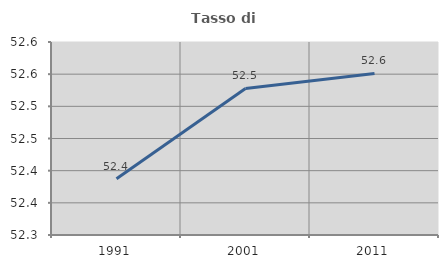
| Category | Tasso di occupazione   |
|---|---|
| 1991.0 | 52.388 |
| 2001.0 | 52.528 |
| 2011.0 | 52.551 |